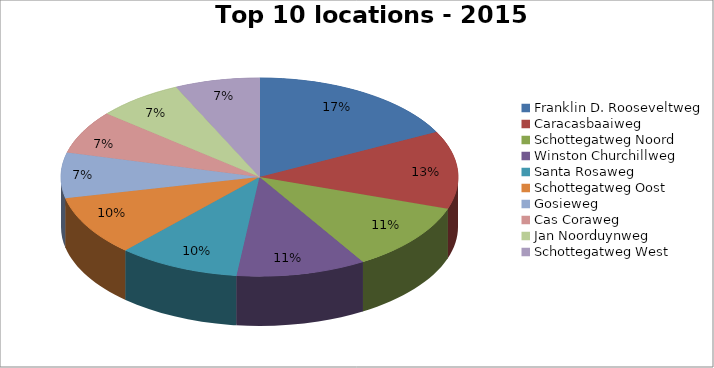
| Category | Series 0 |
|---|---|
| Franklin D. Rooseveltweg | 601 |
| Caracasbaaiweg | 437 |
| Schottegatweg Noord | 383 |
| Winston Churchillweg | 363 |
| Santa Rosaweg | 342 |
| Schottegatweg Oost | 337 |
| Gosieweg | 255 |
| Cas Coraweg | 243 |
| Jan Noorduynweg | 243 |
| Schottegatweg West | 237 |